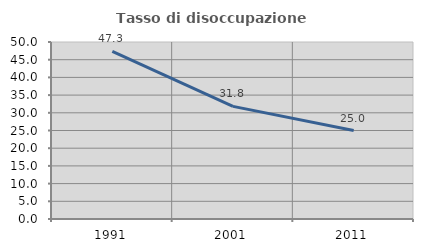
| Category | Tasso di disoccupazione giovanile  |
|---|---|
| 1991.0 | 47.333 |
| 2001.0 | 31.818 |
| 2011.0 | 25 |